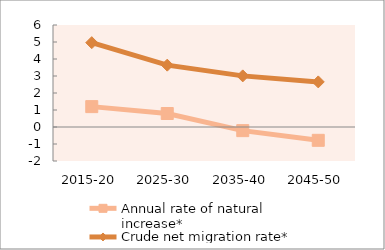
| Category | Annual rate of natural increase* | Crude net migration rate* |
|---|---|---|
| 2015-20 | 1.199 | 4.961 |
| 2025-30 | 0.794 | 3.637 |
| 2035-40 | -0.214 | 3.007 |
| 2045-50 | -0.784 | 2.653 |